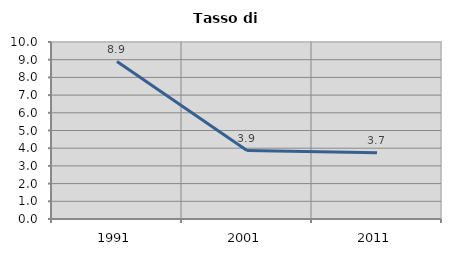
| Category | Tasso di disoccupazione   |
|---|---|
| 1991.0 | 8.898 |
| 2001.0 | 3.865 |
| 2011.0 | 3.738 |